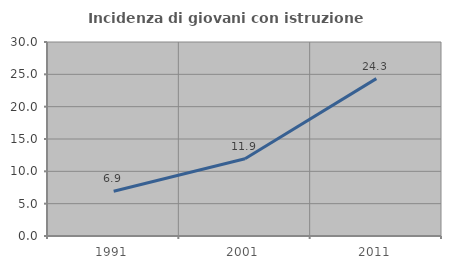
| Category | Incidenza di giovani con istruzione universitaria |
|---|---|
| 1991.0 | 6.914 |
| 2001.0 | 11.94 |
| 2011.0 | 24.34 |